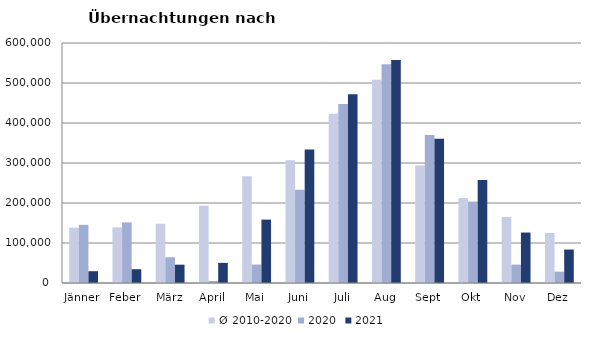
| Category | Ø 2010-2020 | 2020 | 2021 |
|---|---|---|---|
| Jänner | 138168.273 | 145353 | 29476 |
| Feber | 139117.818 | 151431 | 34472 |
| März | 148120.182 | 64358 | 45792 |
| April | 193444 | 5072 | 50285 |
| Mai | 267078.182 | 46179 | 158476 |
| Juni | 307010.273 | 233437 | 333648 |
| Juli | 423318.455 | 447640 | 472159 |
| Aug | 508075.364 | 546671 | 557336 |
| Sept | 293791.364 | 369853 | 360851 |
| Okt | 212194 | 203553 | 257755 |
| Nov | 164966.545 | 46036 | 126150 |
| Dez | 124993.364 | 28378 | 83661 |